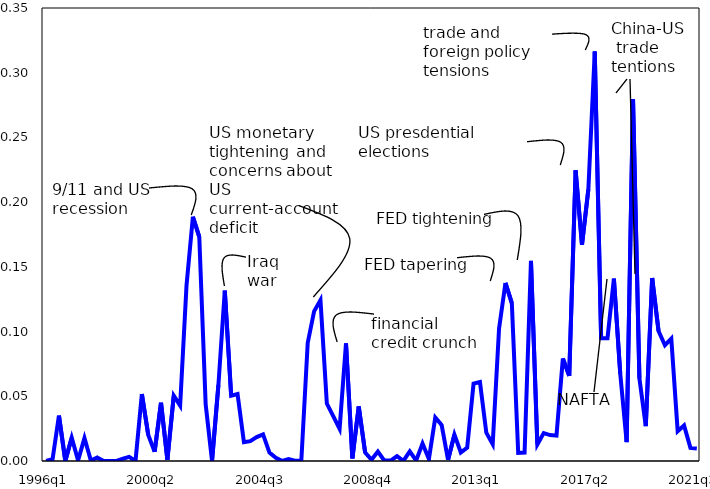
| Category | Series 0 |
|---|---|
| 1996q1 | 0 |
| 1996q2 | 0.001 |
| 1996q3 | 0.035 |
| 1996q4 | 0 |
| 1997q1 | 0.018 |
| 1997q2 | 0 |
| 1997q3 | 0.018 |
| 1997q4 | 0 |
| 1998q1 | 0.003 |
| 1998q2 | 0 |
| 1998q3 | 0 |
| 1998q4 | 0 |
| 1999q1 | 0.002 |
| 1999q2 | 0.003 |
| 1999q3 | 0 |
| 1999q4 | 0.052 |
| 2000q1 | 0.02 |
| 2000q2 | 0.007 |
| 2000q3 | 0.045 |
| 2000q4 | 0.001 |
| 2001q1 | 0.05 |
| 2001q2 | 0.043 |
| 2001q3 | 0.136 |
| 2001q4 | 0.189 |
| 2002q1 | 0.173 |
| 2002q2 | 0.044 |
| 2002q3 | 0 |
| 2002q4 | 0.059 |
| 2003q1 | 0.132 |
| 2003q2 | 0.05 |
| 2003q3 | 0.052 |
| 2003q4 | 0.015 |
| 2004q1 | 0.015 |
| 2004q2 | 0.018 |
| 2004q3 | 0.021 |
| 2004q4 | 0.006 |
| 2005q1 | 0.003 |
| 2005q2 | 0 |
| 2005q3 | 0.001 |
| 2005q4 | 0 |
| 2006q1 | 0 |
| 2006q2 | 0.091 |
| 2006q3 | 0.116 |
| 2006q4 | 0.124 |
| 2007q1 | 0.044 |
| 2007q2 | 0.035 |
| 2007q3 | 0.025 |
| 2007q4 | 0.091 |
| 2008q1 | 0.002 |
| 2008q2 | 0.042 |
| 2008q3 | 0.007 |
| 2008q4 | 0.001 |
| 2009q1 | 0.007 |
| 2009q2 | 0 |
| 2009q3 | 0 |
| 2009q4 | 0.004 |
| 2010q1 | 0 |
| 2010q2 | 0.007 |
| 2010q3 | 0 |
| 2010q4 | 0.013 |
| 2011q1 | 0.002 |
| 2011q2 | 0.034 |
| 2011q3 | 0.028 |
| 2011q4 | 0.001 |
| 2012q1 | 0.02 |
| 2012q2 | 0.007 |
| 2012q3 | 0.01 |
| 2012q4 | 0.06 |
| 2013q1 | 0.061 |
| 2013q2 | 0.022 |
| 2013q3 | 0.013 |
| 2013q4 | 0.102 |
| 2014q1 | 0.138 |
| 2014q2 | 0.122 |
| 2014q3 | 0.006 |
| 2014q4 | 0.007 |
| 2015q1 | 0.155 |
| 2015q2 | 0.013 |
| 2015q3 | 0.022 |
| 2015q4 | 0.02 |
| 2016q1 | 0.02 |
| 2016q2 | 0.079 |
| 2016q3 | 0.066 |
| 2016q4 | 0.225 |
| 2017q1 | 0.167 |
| 2017q2 | 0.21 |
| 2017q3 | 0.316 |
| 2017q4 | 0.095 |
| 2018q1 | 0.095 |
| 2018q2 | 0.141 |
| 2018q3 | 0.067 |
| 2018q4 | 0.015 |
| 2019q1 | 0.28 |
| 2019q2 | 0.064 |
| 2019q3 | 0.027 |
| 2019q4 | 0.141 |
| 2020q1 | 0.1 |
| 2020q2 | 0.089 |
| 2020q3 | 0.095 |
| 2020q4 | 0.023 |
| 2021q1 | 0.027 |
| 2021q2 | 0.01 |
| 2021q3 | 0.01 |